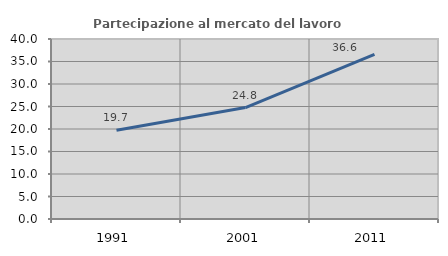
| Category | Partecipazione al mercato del lavoro  femminile |
|---|---|
| 1991.0 | 19.733 |
| 2001.0 | 24.759 |
| 2011.0 | 36.594 |